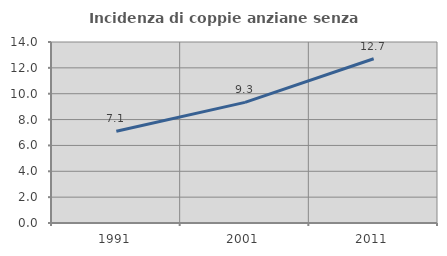
| Category | Incidenza di coppie anziane senza figli  |
|---|---|
| 1991.0 | 7.1 |
| 2001.0 | 9.328 |
| 2011.0 | 12.705 |